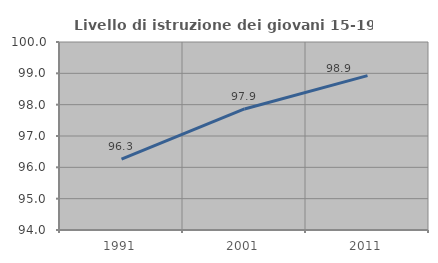
| Category | Livello di istruzione dei giovani 15-19 anni |
|---|---|
| 1991.0 | 96.264 |
| 2001.0 | 97.864 |
| 2011.0 | 98.928 |